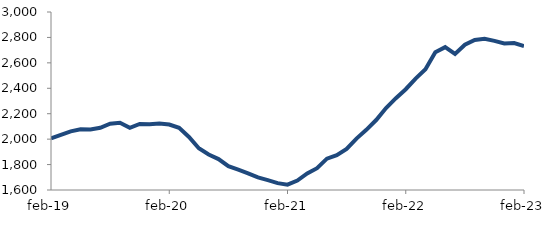
| Category | Series 0 |
|---|---|
| 2019-02-01 | 2005.664 |
| 2019-03-01 | 2033.637 |
| 2019-04-01 | 2060.76 |
| 2019-05-01 | 2078.07 |
| 2019-06-01 | 2076.377 |
| 2019-07-01 | 2089.152 |
| 2019-08-01 | 2121.901 |
| 2019-09-01 | 2128.491 |
| 2019-10-01 | 2088.553 |
| 2019-11-01 | 2119.211 |
| 2019-12-01 | 2116.27 |
| 2020-01-01 | 2123.179 |
| 2020-02-01 | 2115.217 |
| 2020-03-01 | 2088.6 |
| 2020-04-01 | 2017.241 |
| 2020-05-01 | 1928.116 |
| 2020-06-01 | 1878.979 |
| 2020-07-01 | 1843.29 |
| 2020-08-01 | 1787.543 |
| 2020-09-01 | 1760.281 |
| 2020-10-01 | 1731.197 |
| 2020-11-01 | 1698.835 |
| 2020-12-01 | 1677.184 |
| 2021-01-01 | 1654.072 |
| 2021-02-01 | 1641.869 |
| 2021-03-01 | 1673.821 |
| 2021-04-01 | 1730.759 |
| 2021-05-01 | 1771.425 |
| 2021-06-01 | 1846.573 |
| 2021-07-01 | 1874.111 |
| 2021-08-01 | 1922.894 |
| 2021-09-01 | 2004.225 |
| 2021-10-01 | 2073.331 |
| 2021-11-01 | 2150.314 |
| 2021-12-01 | 2244.492 |
| 2022-01-01 | 2321.95 |
| 2022-02-01 | 2392.65 |
| 2022-03-01 | 2476.383 |
| 2022-04-01 | 2549.069 |
| 2022-05-01 | 2683.336 |
| 2022-06-01 | 2723.868 |
| 2022-07-01 | 2670.585 |
| 2022-08-01 | 2742.913 |
| 2022-09-01 | 2780.46 |
| 2022-10-01 | 2788.916 |
| 2022-11-01 | 2772.628 |
| 2022-12-01 | 2752.307 |
| 2023-01-01 | 2755.69 |
| 2023-02-01 | 2732.653 |